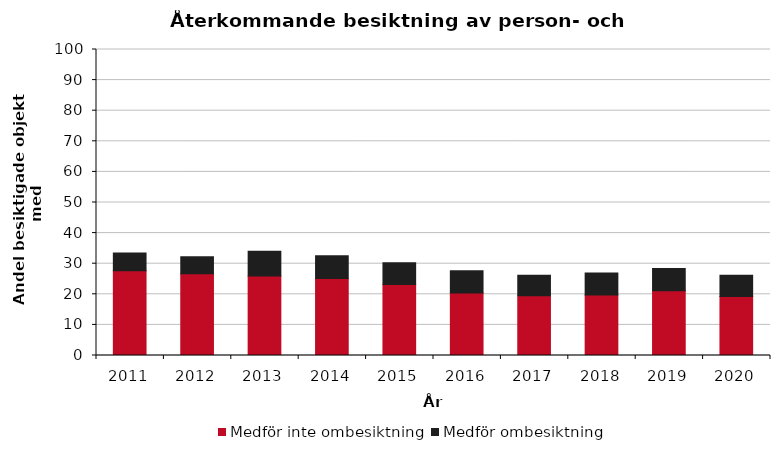
| Category | Medför inte ombesiktning | Medför ombesiktning |
|---|---|---|
| 2011.0 | 27.7 | 5.8 |
| 2012.0 | 26.7 | 5.6 |
| 2013.0 | 26 | 8.1 |
| 2014.0 | 25.2 | 7.4 |
| 2015.0 | 23.2 | 7.1 |
| 2016.0 | 20.4 | 7.3 |
| 2017.0 | 19.5 | 6.7 |
| 2018.0 | 19.8 | 7.2 |
| 2019.0 | 21.2 | 7.2 |
| 2020.0 | 19.3 | 6.9 |